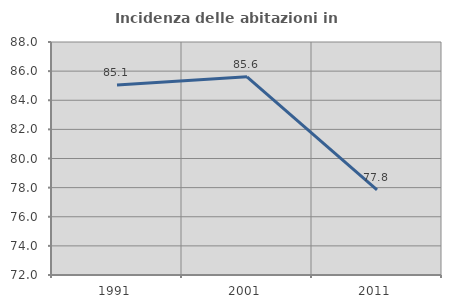
| Category | Incidenza delle abitazioni in proprietà  |
|---|---|
| 1991.0 | 85.052 |
| 2001.0 | 85.611 |
| 2011.0 | 77.843 |